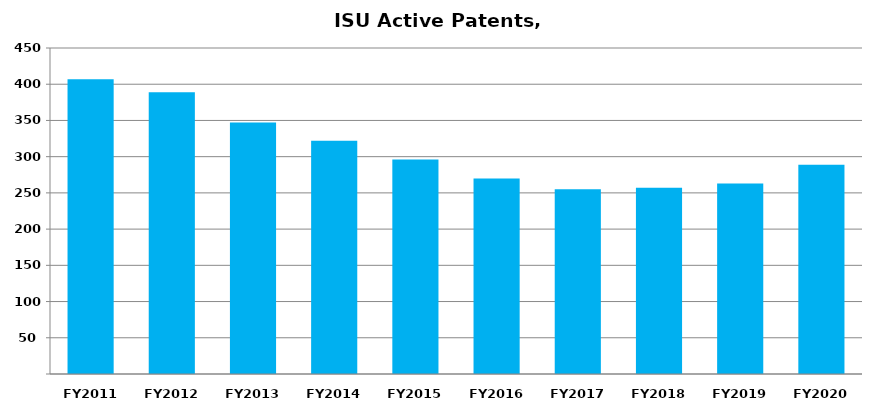
| Category | Active Patents |
|---|---|
| FY2011 | 407 |
| FY2012 | 389 |
| FY2013 | 347 |
| FY2014 | 322 |
| FY2015 | 296 |
| FY2016 | 270 |
| FY2017 | 255 |
| FY2018 | 257 |
| FY2019 | 263 |
| FY2020 | 289 |